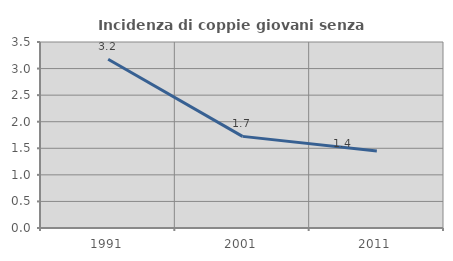
| Category | Incidenza di coppie giovani senza figli |
|---|---|
| 1991.0 | 3.175 |
| 2001.0 | 1.724 |
| 2011.0 | 1.449 |